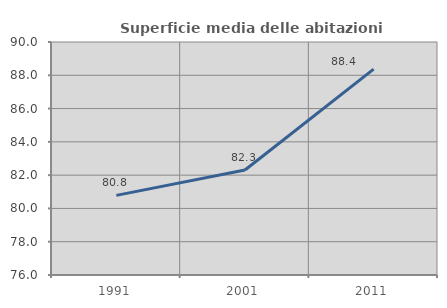
| Category | Superficie media delle abitazioni occupate |
|---|---|
| 1991.0 | 80.784 |
| 2001.0 | 82.311 |
| 2011.0 | 88.371 |